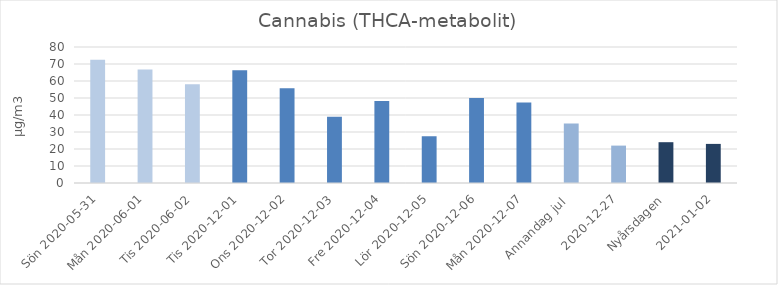
| Category | Cannabis (THCA-metabolit) |
|---|---|
| Sön 2020-05-31 | 72.5 |
| Mån 2020-06-01 | 66.8 |
|  Tis 2020-06-02 | 58.1 |
| Tis 2020-12-01 | 66.3 |
| Ons 2020-12-02 | 55.8 |
| Tor 2020-12-03 | 39 |
| Fre 2020-12-04 | 48.3 |
| Lör 2020-12-05 | 27.5 |
| Sön 2020-12-06 | 50 |
| Mån 2020-12-07 | 47.4 |
| Annandag jul  | 35 |
| 2020-12-27 | 22 |
| Nyårsdagen | 24 |
| 2021-01-02 | 23 |